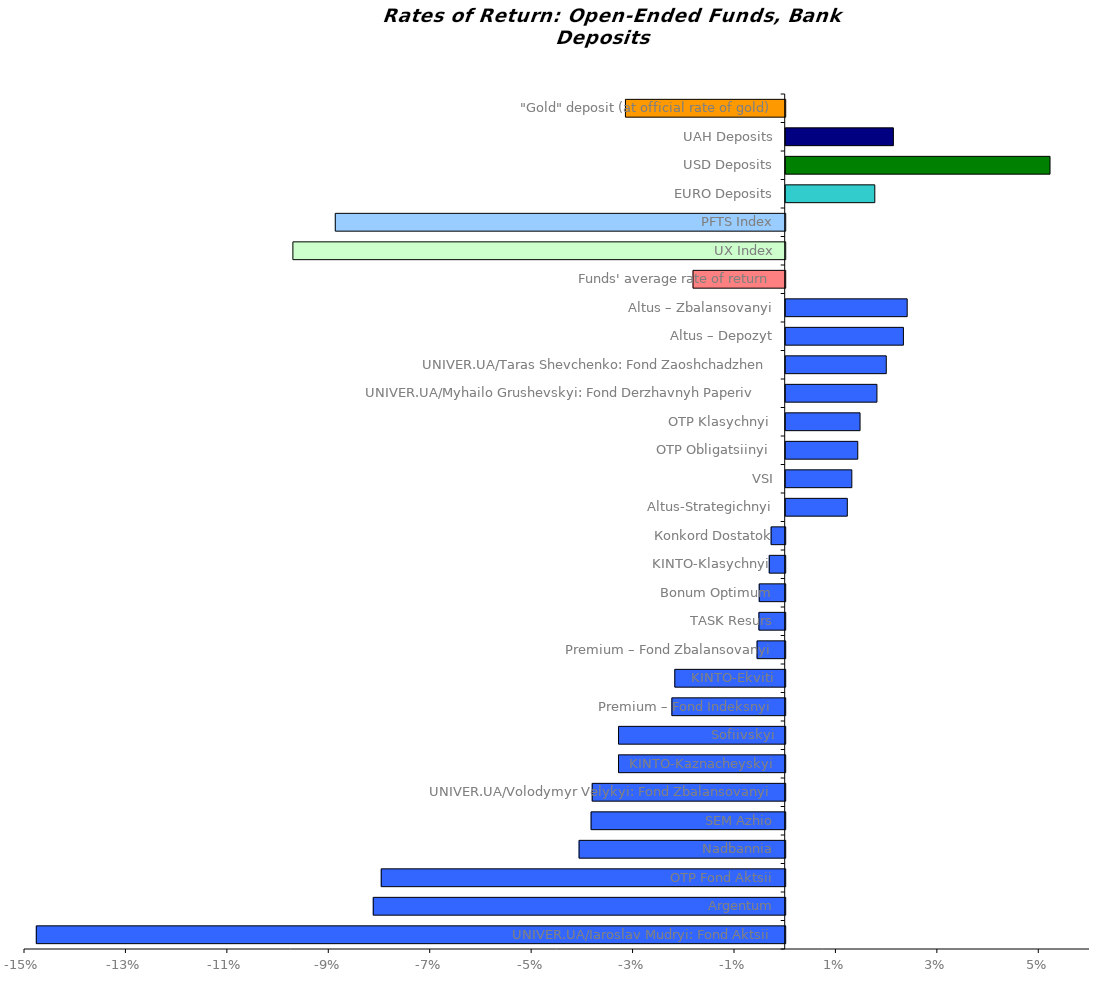
| Category | Series 0 |
|---|---|
| UNIVER.UA/Iaroslav Mudryi: Fond Aktsii | -0.148 |
| Argentum | -0.081 |
| OTP Fond Aktsii | -0.08 |
| Nadbannia | -0.041 |
| SEM Azhio | -0.038 |
| UNIVER.UA/Volodymyr Velykyi: Fond Zbalansovanyi | -0.038 |
| KINTO-Kaznacheyskyi | -0.033 |
| Sofiivskyi | -0.033 |
| Premium – Fond Indeksnyi | -0.022 |
| KINTO-Ekviti | -0.022 |
| Premium – Fond Zbalansovanyi | -0.006 |
| TASK Resurs | -0.005 |
| Bonum Optimum | -0.005 |
| KINTO-Klasychnyi  | -0.003 |
| Коnkord Dostatok | -0.003 |
| Altus-Strategichnyi | 0.012 |
| VSI | 0.013 |
| OTP Obligatsiinyi  | 0.014 |
| OTP Klasychnyi  | 0.015 |
| UNIVER.UA/Myhailo Grushevskyi: Fond Derzhavnyh Paperiv    | 0.018 |
| UNIVER.UA/Taras Shevchenko: Fond Zaoshchadzhen | 0.02 |
| Altus – Depozyt | 0.023 |
| Altus – Zbalansovanyi | 0.024 |
| Funds' average rate of return | -0.018 |
| UX Index | -0.097 |
| PFTS Index | -0.089 |
| EURO Deposits | 0.018 |
| USD Deposits | 0.052 |
| UAH Deposits | 0.021 |
| "Gold" deposit (at official rate of gold) | -0.032 |